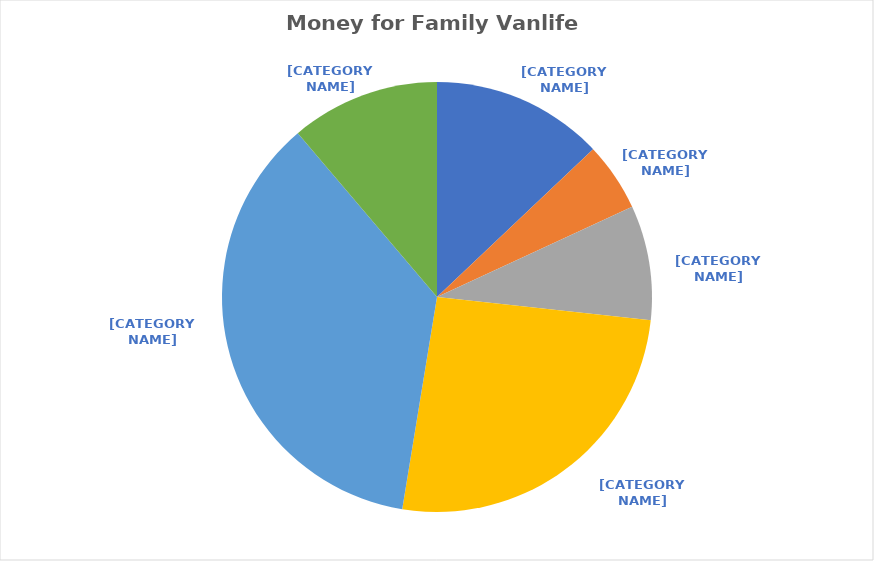
| Category | Series 0 |
|---|---|
| Rent Deposit | 1500 |
| Childcare Deposit | 600 |
| Cam's Tax Return | 1000 |
| My Tax Return | 3000 |
| Monthly Savings | 4200 |
| Thank You Mom | 1300 |